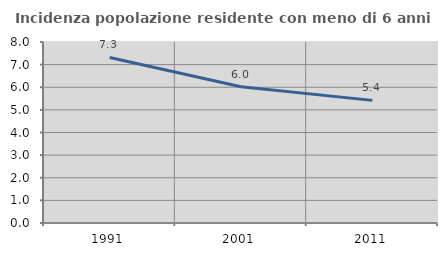
| Category | Incidenza popolazione residente con meno di 6 anni |
|---|---|
| 1991.0 | 7.316 |
| 2001.0 | 6.022 |
| 2011.0 | 5.42 |